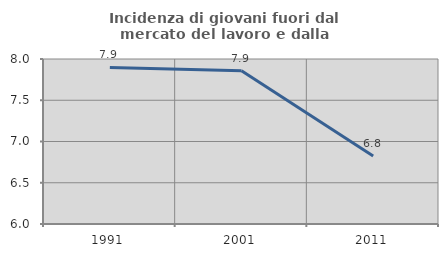
| Category | Incidenza di giovani fuori dal mercato del lavoro e dalla formazione  |
|---|---|
| 1991.0 | 7.898 |
| 2001.0 | 7.857 |
| 2011.0 | 6.825 |